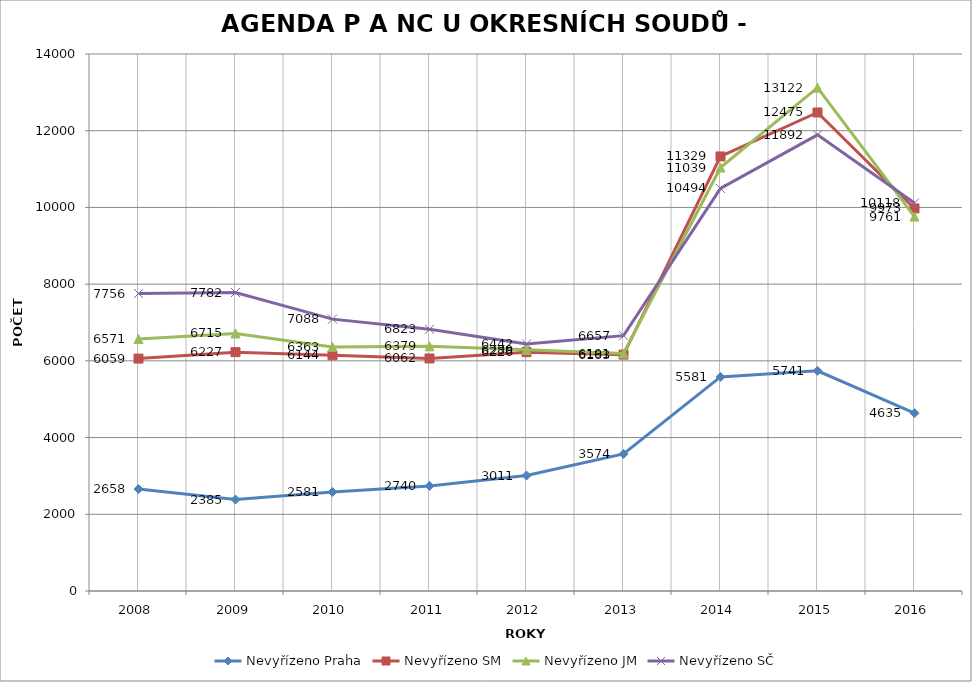
| Category | Nevyřízeno Praha | Nevyřízeno SM | Nevyřízeno JM | Nevyřízeno SČ |
|---|---|---|---|---|
| 2008.0 | 2658 | 6059 | 6571 | 7756 |
| 2009.0 | 2385 | 6227 | 6715 | 7782 |
| 2010.0 | 2581 | 6144 | 6363 | 7088 |
| 2011.0 | 2740 | 6062 | 6379 | 6823 |
| 2012.0 | 3011 | 6226 | 6289 | 6442 |
| 2013.0 | 3574 | 6163 | 6191 | 6657 |
| 2014.0 | 5581 | 11329 | 11039 | 10494 |
| 2015.0 | 5741 | 12475 | 13122 | 11892 |
| 2016.0 | 4635 | 9973 | 9761 | 10118 |